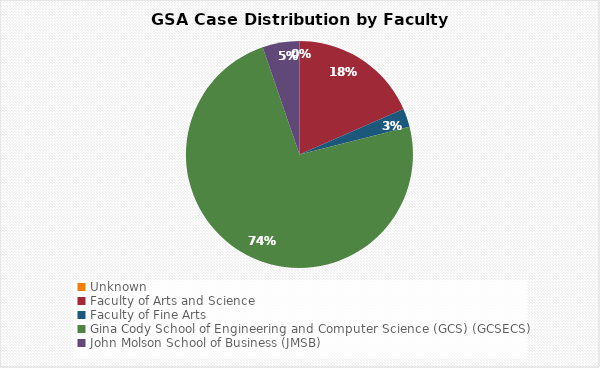
| Category | Series 0 |
|---|---|
| Unknown | 0 |
| Faculty of Arts and Science | 14 |
| Faculty of Fine Arts | 2 |
| Gina Cody School of Engineering and Computer Science (GCS) (GCSECS) | 56 |
| John Molson School of Business (JMSB) | 4 |